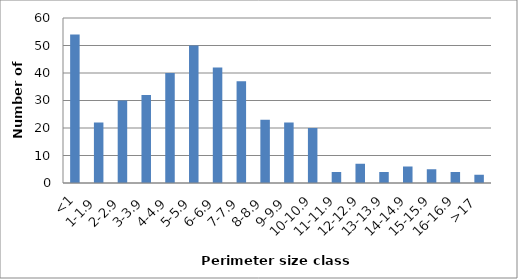
| Category | Series 0 |
|---|---|
| <1 | 54 |
| 1-1.9 | 22 |
| 2-2.9 | 30 |
| 3-3.9 | 32 |
| 4-4.9 | 40 |
| 5-5.9 | 50 |
| 6-6.9 | 42 |
| 7-7.9 | 37 |
| 8-8.9 | 23 |
| 9-9.9 | 22 |
| 10-10.9 | 20 |
| 11-11.9 | 4 |
| 12-12.9 | 7 |
| 13-13.9 | 4 |
| 14-14.9 | 6 |
| 15-15.9 | 5 |
| 16-16.9 | 4 |
| >17 | 3 |